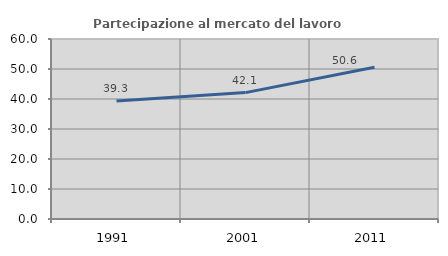
| Category | Partecipazione al mercato del lavoro  femminile |
|---|---|
| 1991.0 | 39.348 |
| 2001.0 | 42.129 |
| 2011.0 | 50.582 |